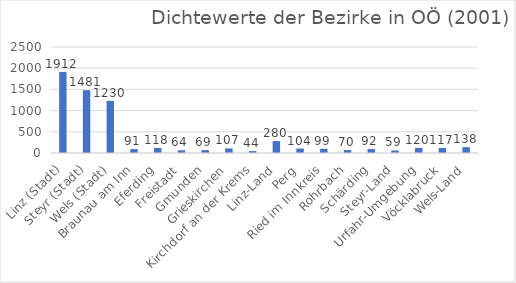
| Category | Series 0 |
|---|---|
| Linz (Stadt) | 1911.898 |
| Steyr (Stadt) | 1481.175 |
| Wels (Stadt) | 1229.922 |
| Braunau am Inn | 91.494 |
| Eferding | 118.392 |
| Freistadt | 64.403 |
| Gmunden | 69.352 |
| Grieskirchen | 107.014 |
| Kirchdorf an der Krems | 44.497 |
| Linz-Land | 280.411 |
| Perg | 104.243 |
| Ried im Innkreis | 99.491 |
| Rohrbach | 69.943 |
| Schärding | 92.153 |
| Steyr-Land | 59.289 |
| Urfahr-Umgebung | 119.726 |
| Vöcklabruck | 116.761 |
| Wels-Land | 137.666 |